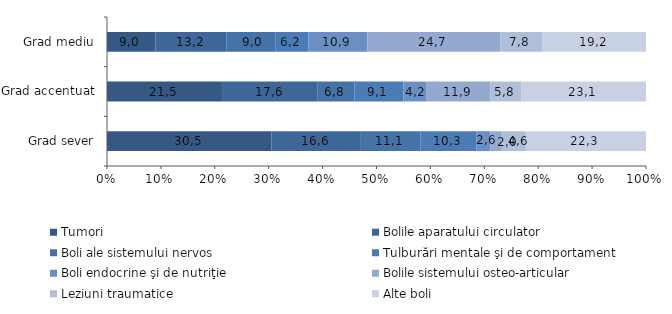
| Category | Tumori | Bolile aparatului circulator | Boli ale sistemului nervos | Tulburări mentale şi de comportament | Boli endocrine şi de nutriţie | Bolile sistemului osteo-articular | Leziuni traumatice | Alte boli  |
|---|---|---|---|---|---|---|---|---|
| Grad sever | 30.5 | 16.6 | 11.1 | 10.3 | 2.6 | 2 | 4.6 | 22.3 |
| Grad accentuat | 21.5 | 17.6 | 6.8 | 9.1 | 4.2 | 11.9 | 5.8 | 23.1 |
| Grad mediu | 9 | 13.2 | 9 | 6.2 | 10.9 | 24.7 | 7.8 | 19.2 |